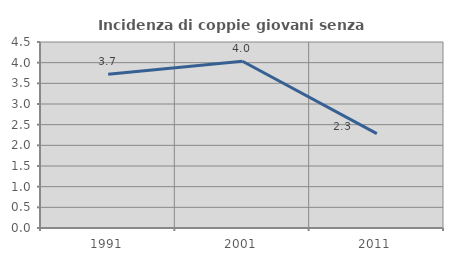
| Category | Incidenza di coppie giovani senza figli |
|---|---|
| 1991.0 | 3.718 |
| 2001.0 | 4.035 |
| 2011.0 | 2.285 |